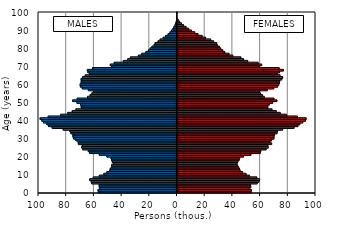
| Category | -5 186 330  | 5 367 513  |
|---|---|---|
| 0.0 | -56803 | 53974 |
| 1.0 | -57075 | 54110 |
| 2.0 | -55721 | 52979 |
| 3.0 | -56156 | 53712 |
| 4.0 | -56257 | 53407 |
| 5.0 | -61556 | 58289 |
| 6.0 | -62019 | 59560 |
| 7.0 | -63056 | 60043 |
| 8.0 | -60457 | 58067 |
| 9.0 | -56106 | 52804 |
| 10.0 | -52851 | 50268 |
| 11.0 | -50674 | 47719 |
| 12.0 | -48577 | 45982 |
| 13.0 | -48154 | 45528 |
| 14.0 | -47147 | 44665 |
| 15.0 | -47228 | 43955 |
| 16.0 | -46000 | 43772 |
| 17.0 | -46769 | 44407 |
| 18.0 | -47263 | 45257 |
| 19.0 | -47696 | 45656 |
| 20.0 | -50641 | 48424 |
| 21.0 | -56118 | 53822 |
| 22.0 | -63178 | 60515 |
| 23.0 | -64057 | 60881 |
| 24.0 | -68132 | 64754 |
| 25.0 | -68810 | 66269 |
| 26.0 | -68414 | 65981 |
| 27.0 | -71227 | 68739 |
| 28.0 | -71388 | 67588 |
| 29.0 | -73005 | 68683 |
| 30.0 | -74595 | 70432 |
| 31.0 | -75140 | 70492 |
| 32.0 | -75247 | 70785 |
| 33.0 | -76721 | 72648 |
| 34.0 | -77317 | 72991 |
| 35.0 | -82169 | 76685 |
| 36.0 | -90149 | 84918 |
| 37.0 | -92721 | 87745 |
| 38.0 | -93938 | 89093 |
| 39.0 | -96436 | 91232 |
| 40.0 | -97618 | 93182 |
| 41.0 | -98857 | 93680 |
| 42.0 | -93031 | 87275 |
| 43.0 | -84005 | 79408 |
| 44.0 | -78923 | 74962 |
| 45.0 | -75668 | 72095 |
| 46.0 | -72997 | 69040 |
| 47.0 | -69150 | 65993 |
| 48.0 | -69231 | 65971 |
| 49.0 | -69668 | 67019 |
| 50.0 | -72240 | 69492 |
| 51.0 | -75380 | 72586 |
| 52.0 | -72127 | 70448 |
| 53.0 | -64634 | 63421 |
| 54.0 | -62715 | 62019 |
| 55.0 | -61480 | 60579 |
| 56.0 | -60258 | 60018 |
| 57.0 | -64018 | 65555 |
| 58.0 | -68399 | 70304 |
| 59.0 | -69783 | 73045 |
| 60.0 | -69968 | 73875 |
| 61.0 | -69268 | 74323 |
| 62.0 | -69157 | 74571 |
| 63.0 | -69245 | 76085 |
| 64.0 | -68124 | 76742 |
| 65.0 | -66274 | 74810 |
| 66.0 | -63184 | 72818 |
| 67.0 | -64403 | 74443 |
| 68.0 | -64738 | 77205 |
| 69.0 | -60945 | 74172 |
| 70.0 | -47103 | 59739 |
| 71.0 | -48175 | 61552 |
| 72.0 | -45347 | 59002 |
| 73.0 | -38761 | 51449 |
| 74.0 | -35576 | 48485 |
| 75.0 | -33631 | 46550 |
| 76.0 | -27896 | 40675 |
| 77.0 | -25477 | 38016 |
| 78.0 | -22472 | 34884 |
| 79.0 | -20657 | 33437 |
| 80.0 | -19425 | 32005 |
| 81.0 | -18144 | 31023 |
| 82.0 | -16569 | 29470 |
| 83.0 | -15791 | 29064 |
| 84.0 | -13724 | 26790 |
| 85.0 | -12208 | 24693 |
| 86.0 | -10005 | 21038 |
| 87.0 | -8184 | 18540 |
| 88.0 | -6416 | 15565 |
| 89.0 | -5103 | 13271 |
| 90.0 | -4057 | 10746 |
| 91.0 | -2958 | 8789 |
| 92.0 | -2292 | 6950 |
| 93.0 | -1495 | 5111 |
| 94.0 | -1071 | 3617 |
| 95.0 | -585 | 2214 |
| 96.0 | -326 | 1248 |
| 97.0 | -129 | 452 |
| 98.0 | -72 | 371 |
| 99.0 | -56 | 236 |
| 100.0 | -169 | 564 |